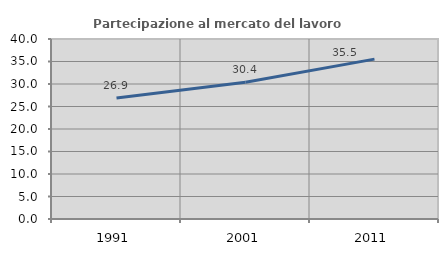
| Category | Partecipazione al mercato del lavoro  femminile |
|---|---|
| 1991.0 | 26.868 |
| 2001.0 | 30.378 |
| 2011.0 | 35.526 |